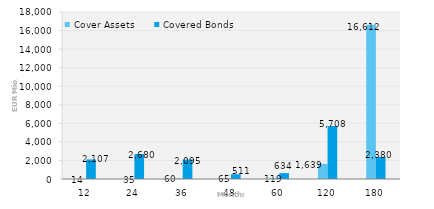
| Category | Cover Assets | Covered Bonds |
|---|---|---|
| 12.0 | 13.954 | 2107 |
| 24.0 | 35.393 | 2680.286 |
| 36.0 | 60.038 | 2094.5 |
| 48.0 | 64.587 | 510.5 |
| 60.0 | 118.984 | 633.98 |
| 120.0 | 1638.569 | 5707.536 |
| 180.0 | 16612.496 | 2379.756 |